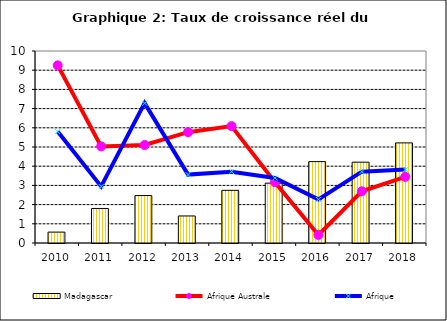
| Category | Madagascar |
|---|---|
| 2010.0 | 0.568 |
| 2011.0 | 1.799 |
| 2012.0 | 2.471 |
| 2013.0 | 1.408 |
| 2014.0 | 2.743 |
| 2015.0 | 3.117 |
| 2016.0 | 4.238 |
| 2017.0 | 4.208 |
| 2018.0 | 5.215 |